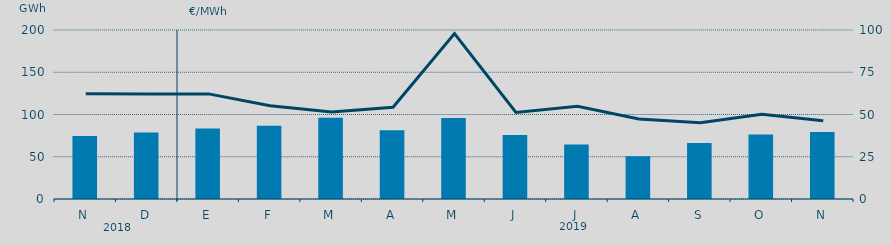
| Category | Energía a subir |
|---|---|
| N | 74.612 |
| D | 78.584 |
| E | 83.556 |
| F | 86.827 |
| M | 96.139 |
| A | 81.387 |
| M | 95.806 |
| J | 75.708 |
| J | 64.438 |
| A | 50.596 |
| S | 66.317 |
| O | 76.273 |
| N | 79.309 |